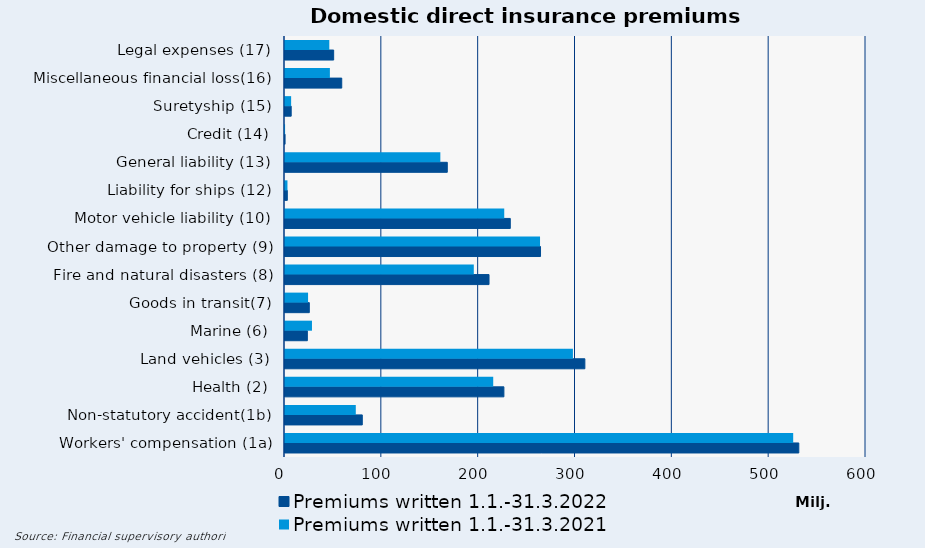
| Category | Premiums written |
|---|---|
| Workers' compensation (1a) | 524808.173 |
| Non-statutory accident(1b) | 73111.188 |
| Health (2) | 215034.143 |
| Land vehicles (3) | 297332.108 |
| Marine (6) | 27853.436 |
| Goods in transit(7) | 23821.282 |
| Fire and natural disasters (8) | 194974.919 |
| Other damage to property (9) | 263378.092 |
| Motor vehicle liability (10) | 226410.398 |
| Liability for ships (12) | 2539.575 |
| General liability (13) | 160427.687 |
| Credit (14) | 78.734 |
| Suretyship (15) | 6327.361 |
| Miscellaneous financial loss(16) | 46359.449 |
| Legal expenses (17) | 45748.894 |